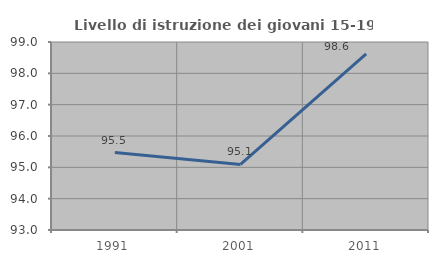
| Category | Livello di istruzione dei giovani 15-19 anni |
|---|---|
| 1991.0 | 95.472 |
| 2001.0 | 95.092 |
| 2011.0 | 98.618 |